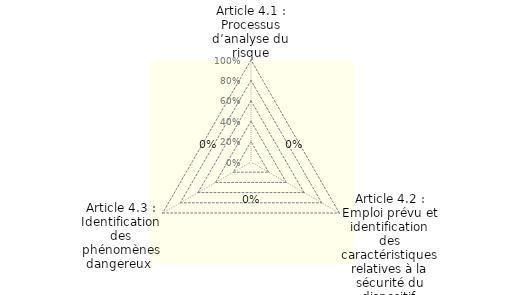
| Category | Series 0 |
|---|---|
| Article 4.1 : Processus d’analyse du risque | 0 |
| Article 4.2 : Emploi prévu et identification des caractéristiques relatives à la sécurité du dispositif médical | 0 |
| Article 4.3 : Identification des phénomènes dangereux  | 0 |